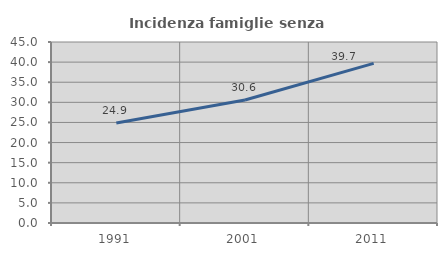
| Category | Incidenza famiglie senza nuclei |
|---|---|
| 1991.0 | 24.88 |
| 2001.0 | 30.583 |
| 2011.0 | 39.691 |